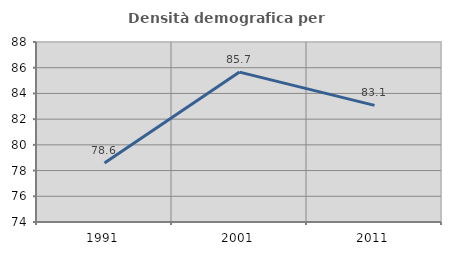
| Category | Densità demografica |
|---|---|
| 1991.0 | 78.582 |
| 2001.0 | 85.66 |
| 2011.0 | 83.07 |